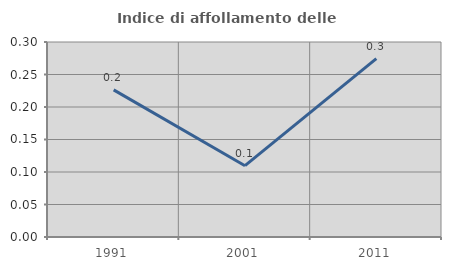
| Category | Indice di affollamento delle abitazioni  |
|---|---|
| 1991.0 | 0.226 |
| 2001.0 | 0.11 |
| 2011.0 | 0.274 |